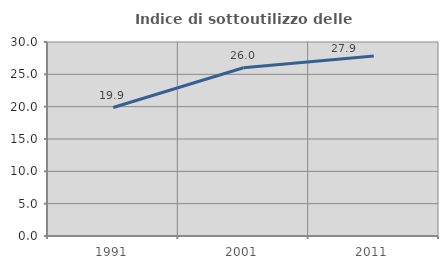
| Category | Indice di sottoutilizzo delle abitazioni  |
|---|---|
| 1991.0 | 19.867 |
| 2001.0 | 26.016 |
| 2011.0 | 27.852 |